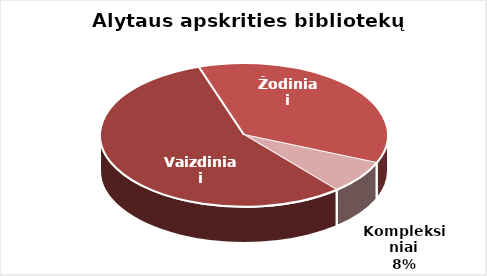
| Category | Series 0 |
|---|---|
| Vaizdiniai | 1514 |
| Žodiniai | 986 |
| Kompleksiniai | 203 |